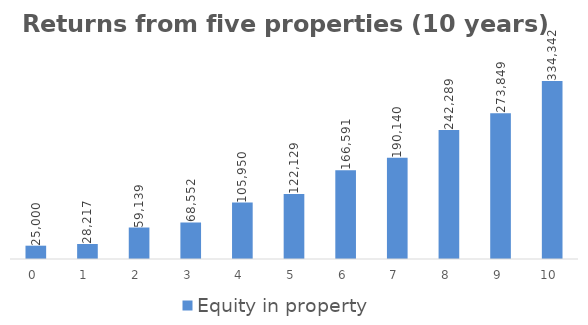
| Category | Equity in property  | Total equity  |
|---|---|---|
| 0.0 | 25000 | 25000 |
| 1.0 | 28217.328 | 28217.328 |
| 2.0 | 59138.954 | 59138.954 |
| 3.0 | 68551.653 | 68551.653 |
| 4.0 | 105949.94 | 105949.94 |
| 5.0 | 122128.756 | 122128.756 |
| 6.0 | 166591.028 | 166591.028 |
| 7.0 | 190140.363 | 190140.363 |
| 8.0 | 242288.619 | 242288.619 |
| 9.0 | 273848.605 | 273848.605 |
| 10.0 | 334341.661 | 334341.661 |